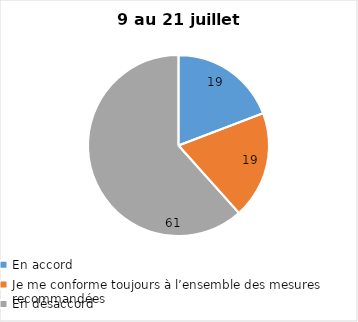
| Category | Series 0 |
|---|---|
| En accord | 19 |
| Je me conforme toujours à l’ensemble des mesures recommandées | 19 |
| En désaccord | 61 |